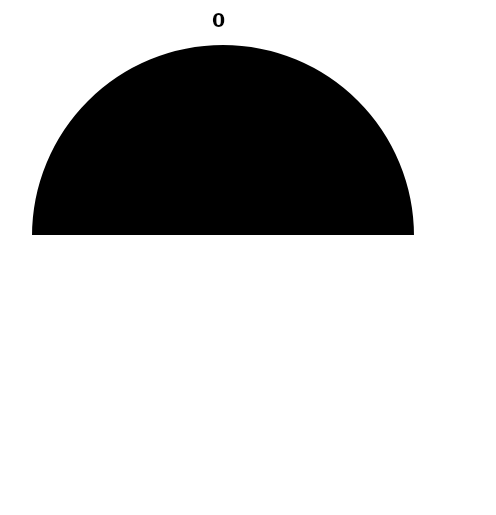
| Category | Series 1 |
|---|---|
| 0 | 0 |
| 1 | 0.5 |
| 2 | -0.5 |